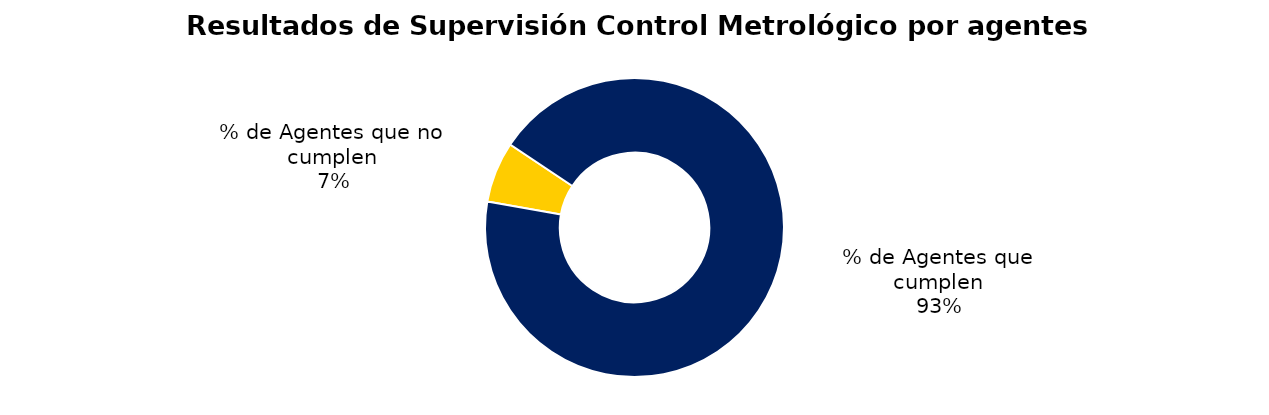
| Category | Series 0 |
|---|---|
| % de Agentes que no cumplen | 43 |
| % de Agentes que cumplen | 609 |